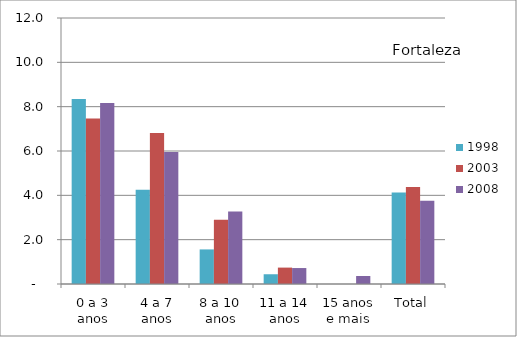
| Category | 1998 | 2003 | 2008 |
|---|---|---|---|
| 0 a 3 anos | 8.35 | 7.47 | 8.16 |
| 4 a 7 anos | 4.25 | 6.81 | 5.96 |
| 8 a 10 anos | 1.56 | 2.9 | 3.27 |
| 11 a 14 anos | 0.44 | 0.74 | 0.72 |
| 15 anos e mais | 0 | 0 | 0.36 |
| Total | 4.13 | 4.38 | 3.76 |